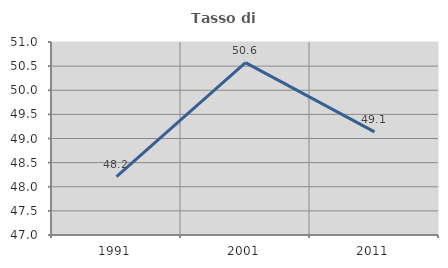
| Category | Tasso di occupazione   |
|---|---|
| 1991.0 | 48.208 |
| 2001.0 | 50.572 |
| 2011.0 | 49.137 |